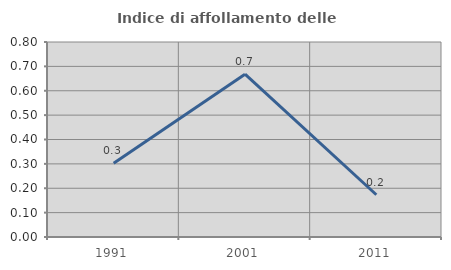
| Category | Indice di affollamento delle abitazioni  |
|---|---|
| 1991.0 | 0.302 |
| 2001.0 | 0.668 |
| 2011.0 | 0.173 |